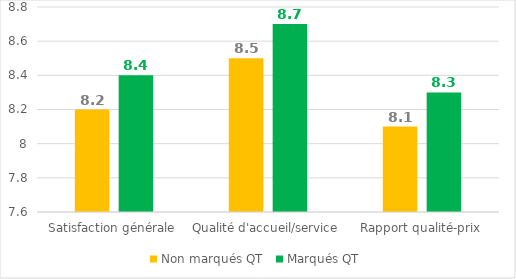
| Category | Non marqués QT  | Marqués QT |
|---|---|---|
| Satisfaction générale | 8.2 | 8.4 |
| Qualité d'accueil/service | 8.5 | 8.7 |
| Rapport qualité-prix | 8.1 | 8.3 |